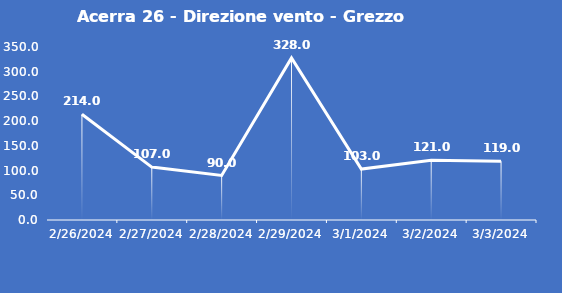
| Category | Acerra 26 - Direzione vento - Grezzo (°N) |
|---|---|
| 2/26/24 | 214 |
| 2/27/24 | 107 |
| 2/28/24 | 90 |
| 2/29/24 | 328 |
| 3/1/24 | 103 |
| 3/2/24 | 121 |
| 3/3/24 | 119 |